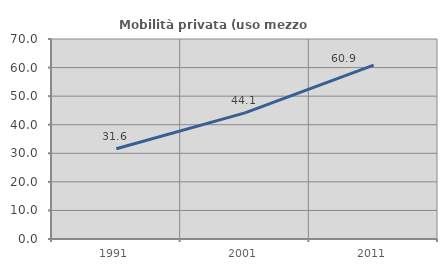
| Category | Mobilità privata (uso mezzo privato) |
|---|---|
| 1991.0 | 31.579 |
| 2001.0 | 44.131 |
| 2011.0 | 60.87 |